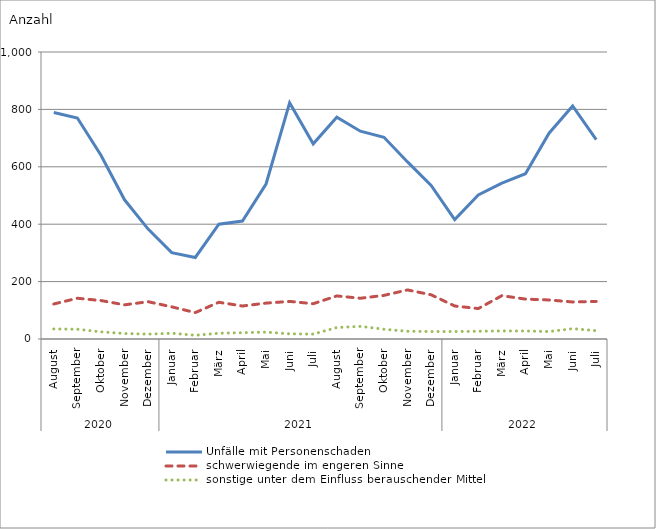
| Category | Unfälle mit Personenschaden | schwerwiegende im engeren Sinne | sonstige unter dem Einfluss berauschender Mittel |
|---|---|---|---|
| 0 | 789 | 122 | 35 |
| 1 | 770 | 142 | 34 |
| 2 | 640 | 134 | 25 |
| 3 | 485 | 119 | 19 |
| 4 | 383 | 130 | 17 |
| 5 | 301 | 112 | 20 |
| 6 | 284 | 92 | 13 |
| 7 | 400 | 128 | 20 |
| 8 | 411 | 115 | 22 |
| 9 | 540 | 125 | 24 |
| 10 | 823 | 131 | 18 |
| 11 | 680 | 123 | 17 |
| 12 | 773 | 150 | 40 |
| 13 | 724 | 142 | 44 |
| 14 | 703 | 152 | 34 |
| 15 | 617 | 171 | 27 |
| 16 | 535 | 154 | 26 |
| 17 | 416 | 115 | 26 |
| 18 | 502 | 106 | 27 |
| 19 | 543 | 151 | 28 |
| 20 | 576 | 139 | 28 |
| 21 | 717 | 136 | 26 |
| 22 | 812 | 129 | 36 |
| 23 | 695 | 131 | 29 |